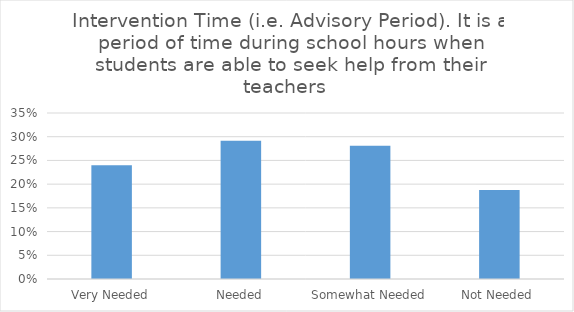
| Category | Intervention Time (i.e. Advisory Period). It is a period of time during school hours when students are able to seek help from their teachers  |
|---|---|
| Very Needed | 0.24 |
| Needed | 0.292 |
| Somewhat Needed | 0.281 |
| Not Needed | 0.188 |